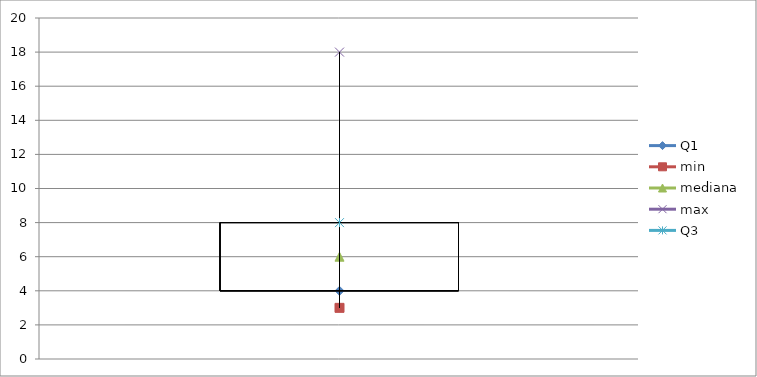
| Category | Q1 | min | mediana | max | Q3 |
|---|---|---|---|---|---|
| 0 | 4 | 3 | 6 | 18 | 8 |